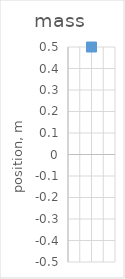
| Category | mass |
|---|---|
| 0 | 0.5 |